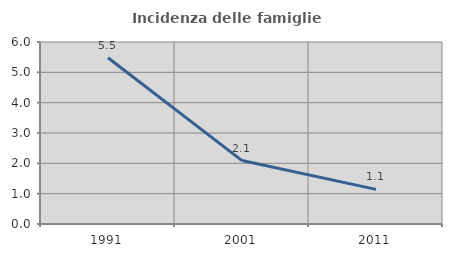
| Category | Incidenza delle famiglie numerose |
|---|---|
| 1991.0 | 5.479 |
| 2001.0 | 2.091 |
| 2011.0 | 1.142 |